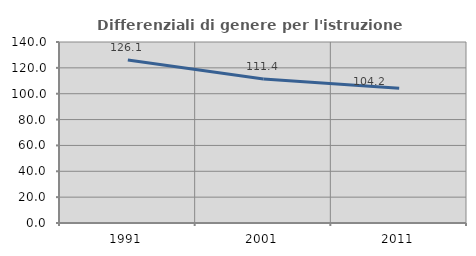
| Category | Differenziali di genere per l'istruzione superiore |
|---|---|
| 1991.0 | 126.114 |
| 2001.0 | 111.395 |
| 2011.0 | 104.162 |